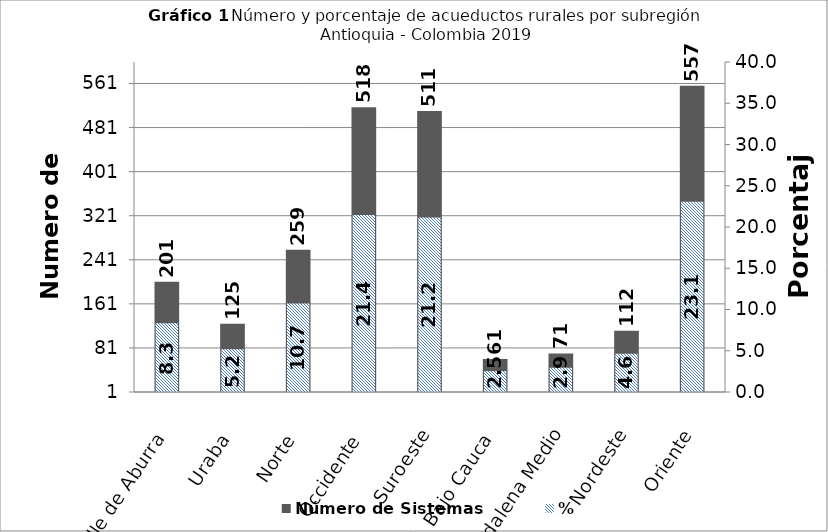
| Category | Número de Sistemas |
|---|---|
| 0 | 201 |
| 1 | 125 |
| 2 | 259 |
| 3 | 518 |
| 4 | 511 |
| 5 | 61 |
| 6 | 71 |
| 7 | 112 |
| 8 | 557 |